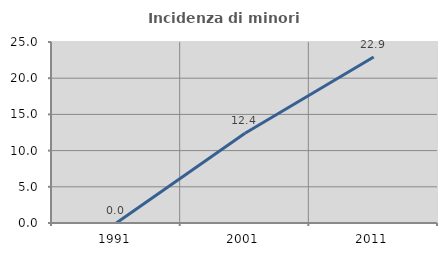
| Category | Incidenza di minori stranieri |
|---|---|
| 1991.0 | 0 |
| 2001.0 | 12.403 |
| 2011.0 | 22.932 |